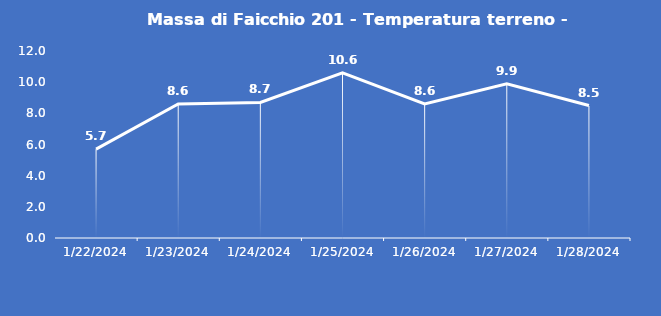
| Category | Massa di Faicchio 201 - Temperatura terreno - Grezzo (°C) |
|---|---|
| 1/22/24 | 5.7 |
| 1/23/24 | 8.6 |
| 1/24/24 | 8.7 |
| 1/25/24 | 10.6 |
| 1/26/24 | 8.6 |
| 1/27/24 | 9.9 |
| 1/28/24 | 8.5 |